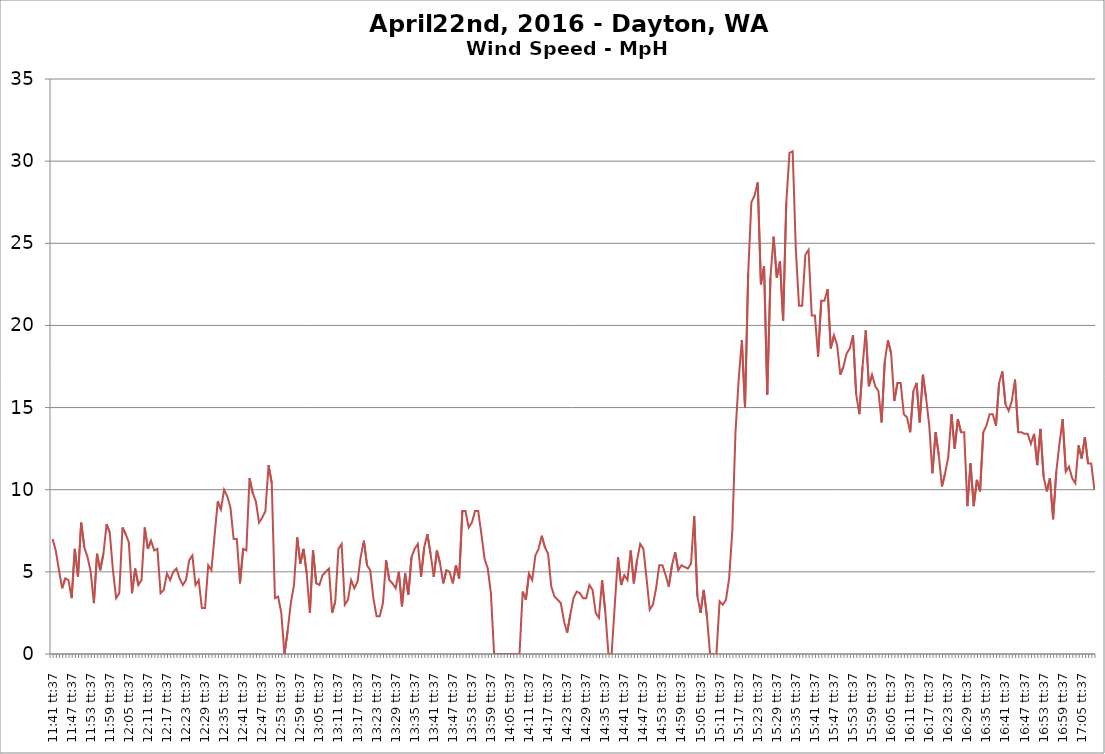
| Category | Wind Speed - MpH |
|---|---|
| 0.48723379629629626 | 7 |
| 0.48792824074074076 | 6.3 |
| 0.4886226851851852 | 5.1 |
| 0.48931712962962964 | 4 |
| 0.4900115740740741 | 4.6 |
| 0.4907060185185185 | 4.5 |
| 0.49140046296296297 | 3.4 |
| 0.4920949074074074 | 6.4 |
| 0.49278935185185185 | 4.7 |
| 0.4934837962962963 | 8 |
| 0.49417824074074074 | 6.5 |
| 0.4948726851851852 | 5.9 |
| 0.4955671296296296 | 5 |
| 0.49626157407407406 | 3.1 |
| 0.4969560185185185 | 6.1 |
| 0.49765046296296295 | 5.1 |
| 0.4983449074074074 | 6.1 |
| 0.4990393518518519 | 7.9 |
| 0.4997337962962963 | 7.4 |
| 0.5004282407407408 | 5.1 |
| 0.5011226851851852 | 3.4 |
| 0.5018171296296297 | 3.7 |
| 0.5025115740740741 | 7.7 |
| 0.5032060185185185 | 7.3 |
| 0.503900462962963 | 6.8 |
| 0.5045949074074074 | 3.7 |
| 0.5052893518518519 | 5.2 |
| 0.5059837962962963 | 4.2 |
| 0.5066782407407407 | 4.5 |
| 0.5073726851851852 | 7.7 |
| 0.5080671296296296 | 6.4 |
| 0.5087615740740741 | 6.9 |
| 0.5094560185185185 | 6.3 |
| 0.510150462962963 | 6.4 |
| 0.5108449074074074 | 3.7 |
| 0.5115393518518518 | 3.9 |
| 0.5122337962962963 | 4.9 |
| 0.5129282407407407 | 4.5 |
| 0.5136226851851852 | 5 |
| 0.5143171296296296 | 5.2 |
| 0.515011574074074 | 4.6 |
| 0.5157060185185185 | 4.2 |
| 0.5164004629629629 | 4.5 |
| 0.5170949074074074 | 5.7 |
| 0.5177893518518518 | 6 |
| 0.5184837962962963 | 4.2 |
| 0.5191782407407407 | 4.5 |
| 0.5198726851851853 | 2.8 |
| 0.5205671296296296 | 2.8 |
| 0.5212615740740741 | 5.4 |
| 0.5219560185185185 | 5.1 |
| 0.522650462962963 | 7.2 |
| 0.5233449074074074 | 9.3 |
| 0.5240393518518519 | 8.8 |
| 0.5247337962962962 | 10 |
| 0.5254282407407408 | 9.6 |
| 0.5261226851851851 | 8.9 |
| 0.5268171296296297 | 7 |
| 0.527511574074074 | 7 |
| 0.5282060185185186 | 4.3 |
| 0.5289004629629629 | 6.4 |
| 0.5295949074074074 | 6.3 |
| 0.5302893518518519 | 10.7 |
| 0.5309837962962963 | 9.8 |
| 0.5316782407407408 | 9.3 |
| 0.5323726851851852 | 8 |
| 0.5330671296296297 | 8.3 |
| 0.5337615740740741 | 8.7 |
| 0.5344560185185185 | 11.5 |
| 0.535150462962963 | 10.4 |
| 0.5358449074074074 | 3.4 |
| 0.5365393518518519 | 3.5 |
| 0.5372337962962963 | 2.5 |
| 0.5379282407407407 | 0 |
| 0.5386226851851852 | 1.4 |
| 0.5393171296296296 | 3.1 |
| 0.5400115740740741 | 4.2 |
| 0.5407060185185185 | 7.1 |
| 0.541400462962963 | 5.5 |
| 0.5420949074074074 | 6.4 |
| 0.5427893518518518 | 4.9 |
| 0.5434837962962963 | 2.5 |
| 0.5441782407407407 | 6.3 |
| 0.5448726851851852 | 4.3 |
| 0.5455671296296296 | 4.2 |
| 0.546261574074074 | 4.8 |
| 0.5469560185185185 | 5 |
| 0.5476504629629629 | 5.2 |
| 0.5483449074074074 | 2.5 |
| 0.5490393518518518 | 3.2 |
| 0.5497337962962963 | 6.4 |
| 0.5504282407407407 | 6.7 |
| 0.5511226851851853 | 3 |
| 0.5518171296296296 | 3.3 |
| 0.5525115740740741 | 4.5 |
| 0.5532060185185185 | 4 |
| 0.553900462962963 | 4.4 |
| 0.5545949074074074 | 5.9 |
| 0.5552893518518519 | 6.9 |
| 0.5559837962962962 | 5.4 |
| 0.5566782407407408 | 5.1 |
| 0.5573726851851851 | 3.4 |
| 0.5580671296296297 | 2.3 |
| 0.558761574074074 | 2.3 |
| 0.5594560185185186 | 3.1 |
| 0.5601504629629629 | 5.7 |
| 0.5608449074074074 | 4.5 |
| 0.5615393518518519 | 4.3 |
| 0.5622337962962963 | 4 |
| 0.5629282407407408 | 5 |
| 0.5636226851851852 | 2.9 |
| 0.5643171296296297 | 4.9 |
| 0.5650115740740741 | 3.6 |
| 0.5657060185185185 | 5.9 |
| 0.566400462962963 | 6.4 |
| 0.5670949074074074 | 6.7 |
| 0.5677893518518519 | 4.7 |
| 0.5684837962962963 | 6.5 |
| 0.5691782407407407 | 7.3 |
| 0.5698726851851852 | 6.1 |
| 0.5705671296296296 | 4.7 |
| 0.5712615740740741 | 6.3 |
| 0.5719560185185185 | 5.5 |
| 0.572650462962963 | 4.3 |
| 0.5733449074074074 | 5.1 |
| 0.5740393518518518 | 5 |
| 0.5747337962962963 | 4.3 |
| 0.5754282407407407 | 5.4 |
| 0.5761226851851852 | 4.6 |
| 0.5768171296296296 | 8.7 |
| 0.577511574074074 | 8.7 |
| 0.5782060185185185 | 7.7 |
| 0.5789004629629629 | 8 |
| 0.5795949074074074 | 8.7 |
| 0.5802893518518518 | 8.7 |
| 0.5809837962962963 | 7.3 |
| 0.5816782407407407 | 5.8 |
| 0.5823726851851853 | 5.2 |
| 0.5830671296296296 | 3.7 |
| 0.5837615740740741 | 0 |
| 0.5844560185185185 | 0 |
| 0.585150462962963 | 0 |
| 0.5858449074074074 | 0 |
| 0.5865393518518519 | 0 |
| 0.5872337962962962 | 0 |
| 0.5879282407407408 | 0 |
| 0.5886226851851851 | 0 |
| 0.5893171296296297 | 0 |
| 0.590011574074074 | 3.8 |
| 0.5907060185185186 | 3.3 |
| 0.5914004629629629 | 4.9 |
| 0.5920949074074074 | 4.5 |
| 0.5927893518518519 | 6 |
| 0.5934837962962963 | 6.4 |
| 0.5941782407407408 | 7.2 |
| 0.5948726851851852 | 6.5 |
| 0.5955671296296297 | 6.1 |
| 0.5962615740740741 | 4.1 |
| 0.5969560185185185 | 3.5 |
| 0.597650462962963 | 3.3 |
| 0.5983449074074074 | 3.1 |
| 0.5990393518518519 | 2 |
| 0.5997337962962963 | 1.3 |
| 0.6004282407407407 | 2.4 |
| 0.6011226851851852 | 3.4 |
| 0.6018171296296296 | 3.8 |
| 0.6025115740740741 | 3.7 |
| 0.6032060185185185 | 3.4 |
| 0.603900462962963 | 3.4 |
| 0.6045949074074074 | 4.2 |
| 0.6052893518518518 | 3.9 |
| 0.6059837962962963 | 2.5 |
| 0.6066782407407407 | 2.2 |
| 0.6073726851851852 | 4.5 |
| 0.6080671296296296 | 2.6 |
| 0.608761574074074 | 0 |
| 0.6094560185185185 | 0 |
| 0.6101504629629629 | 3 |
| 0.6108449074074074 | 5.9 |
| 0.6115393518518518 | 4.2 |
| 0.6122337962962963 | 4.8 |
| 0.6129282407407407 | 4.5 |
| 0.6136226851851853 | 6.3 |
| 0.6143171296296296 | 4.3 |
| 0.6150115740740741 | 5.7 |
| 0.6157060185185185 | 6.7 |
| 0.616400462962963 | 6.4 |
| 0.6170949074074074 | 4.6 |
| 0.6177893518518519 | 2.7 |
| 0.6184837962962962 | 3 |
| 0.6191782407407408 | 4 |
| 0.6198726851851851 | 5.4 |
| 0.6205671296296297 | 5.4 |
| 0.621261574074074 | 4.8 |
| 0.6219560185185186 | 4.1 |
| 0.6226504629629629 | 5.4 |
| 0.6233449074074074 | 6.2 |
| 0.6240393518518519 | 5.1 |
| 0.6247337962962963 | 5.4 |
| 0.6254282407407408 | 5.3 |
| 0.6261226851851852 | 5.2 |
| 0.6268171296296297 | 5.5 |
| 0.6275115740740741 | 8.4 |
| 0.6282060185185185 | 3.5 |
| 0.628900462962963 | 2.5 |
| 0.6295949074074074 | 3.9 |
| 0.6302893518518519 | 2.3 |
| 0.6309837962962963 | 0 |
| 0.6316782407407407 | 0 |
| 0.6323726851851852 | 0 |
| 0.6330671296296296 | 3.2 |
| 0.6337615740740741 | 3 |
| 0.6344560185185185 | 3.3 |
| 0.635150462962963 | 4.6 |
| 0.6358449074074074 | 7.5 |
| 0.6365393518518518 | 13.5 |
| 0.6372337962962963 | 16.7 |
| 0.6379282407407407 | 19.1 |
| 0.6386226851851852 | 15 |
| 0.6393171296296296 | 23.2 |
| 0.640011574074074 | 27.5 |
| 0.6407060185185185 | 27.9 |
| 0.6414004629629629 | 28.7 |
| 0.6420949074074074 | 22.5 |
| 0.6427893518518518 | 23.6 |
| 0.6434837962962963 | 15.8 |
| 0.6441782407407407 | 22.9 |
| 0.6448726851851853 | 25.4 |
| 0.6455671296296296 | 22.9 |
| 0.6462615740740741 | 23.9 |
| 0.6469560185185185 | 20.3 |
| 0.647650462962963 | 27.5 |
| 0.6483449074074074 | 30.5 |
| 0.6490393518518519 | 30.6 |
| 0.6497337962962962 | 24.6 |
| 0.6504282407407408 | 21.2 |
| 0.6511226851851851 | 21.2 |
| 0.6518171296296297 | 24.3 |
| 0.652511574074074 | 24.6 |
| 0.6532060185185186 | 20.6 |
| 0.6539004629629629 | 20.6 |
| 0.6545949074074074 | 18.1 |
| 0.6552893518518519 | 21.5 |
| 0.6559837962962963 | 21.5 |
| 0.6566782407407408 | 22.2 |
| 0.6573726851851852 | 18.6 |
| 0.6580671296296297 | 19.4 |
| 0.6587615740740741 | 18.8 |
| 0.6594560185185185 | 17 |
| 0.660150462962963 | 17.5 |
| 0.6608449074074074 | 18.3 |
| 0.6615393518518519 | 18.6 |
| 0.6622337962962963 | 19.4 |
| 0.6629282407407407 | 15.8 |
| 0.6636226851851852 | 14.6 |
| 0.6643171296296296 | 17.5 |
| 0.6650115740740741 | 19.7 |
| 0.6657060185185185 | 16.3 |
| 0.666400462962963 | 17 |
| 0.6670949074074074 | 16.3 |
| 0.667789351851852 | 16 |
| 0.6684837962962963 | 14.1 |
| 0.6691782407407407 | 17.8 |
| 0.6698726851851852 | 19.1 |
| 0.6705671296296297 | 18.3 |
| 0.671261574074074 | 15.4 |
| 0.6719560185185185 | 16.5 |
| 0.6726504629629629 | 16.5 |
| 0.6733449074074075 | 14.6 |
| 0.6740393518518518 | 14.4 |
| 0.6747337962962963 | 13.5 |
| 0.6754282407407407 | 16 |
| 0.6761226851851853 | 16.5 |
| 0.6768171296296296 | 14.1 |
| 0.677511574074074 | 17 |
| 0.6782060185185186 | 15.6 |
| 0.678900462962963 | 13.9 |
| 0.6795949074074074 | 11 |
| 0.6802893518518518 | 13.5 |
| 0.6809837962962964 | 12.1 |
| 0.6816782407407408 | 10.2 |
| 0.6823726851851851 | 11 |
| 0.6830671296296296 | 12 |
| 0.6837615740740741 | 14.6 |
| 0.6844560185185186 | 12.5 |
| 0.6851504629629629 | 14.3 |
| 0.6858449074074073 | 13.5 |
| 0.6865393518518519 | 13.5 |
| 0.6872337962962963 | 9 |
| 0.6879282407407407 | 11.6 |
| 0.6886226851851852 | 9 |
| 0.6893171296296297 | 10.6 |
| 0.6900115740740741 | 9.9 |
| 0.6907060185185184 | 13.5 |
| 0.691400462962963 | 13.9 |
| 0.6920949074074074 | 14.6 |
| 0.6927893518518519 | 14.6 |
| 0.6934837962962962 | 13.9 |
| 0.6941782407407407 | 16.5 |
| 0.6948726851851852 | 17.2 |
| 0.6955671296296296 | 15.2 |
| 0.696261574074074 | 14.8 |
| 0.6969560185185185 | 15.4 |
| 0.697650462962963 | 16.7 |
| 0.6983449074074074 | 13.5 |
| 0.699039351851852 | 13.5 |
| 0.6997337962962963 | 13.4 |
| 0.7004282407407407 | 13.4 |
| 0.7011226851851852 | 12.8 |
| 0.7018171296296297 | 13.4 |
| 0.702511574074074 | 11.5 |
| 0.7032060185185185 | 13.7 |
| 0.7039004629629629 | 10.8 |
| 0.7045949074074075 | 9.9 |
| 0.7052893518518518 | 10.7 |
| 0.7059837962962963 | 8.2 |
| 0.7066782407407407 | 11.1 |
| 0.7073726851851853 | 12.8 |
| 0.7080671296296296 | 14.3 |
| 0.708761574074074 | 11.1 |
| 0.7094560185185186 | 11.4 |
| 0.710150462962963 | 10.7 |
| 0.7108449074074074 | 10.4 |
| 0.7115393518518518 | 12.7 |
| 0.7122337962962964 | 11.9 |
| 0.7129282407407408 | 13.2 |
| 0.7136226851851851 | 11.6 |
| 0.7143171296296296 | 11.6 |
| 0.7150115740740741 | 10 |